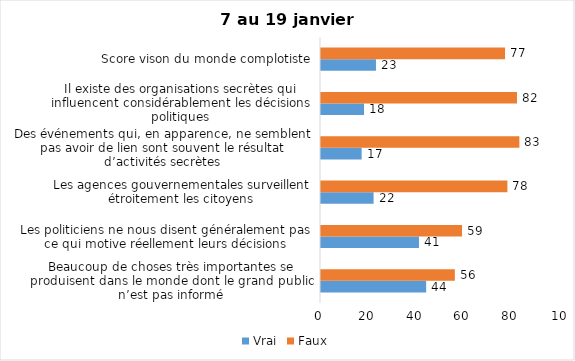
| Category | Vrai | Faux |
|---|---|---|
| Beaucoup de choses très importantes se produisent dans le monde dont le grand public n’est pas informé | 44 | 56 |
| Les politiciens ne nous disent généralement pas ce qui motive réellement leurs décisions | 41 | 59 |
| Les agences gouvernementales surveillent étroitement les citoyens | 22 | 78 |
| Des événements qui, en apparence, ne semblent pas avoir de lien sont souvent le résultat d’activités secrètes | 17 | 83 |
| Il existe des organisations secrètes qui influencent considérablement les décisions politiques | 18 | 82 |
| Score vison du monde complotiste | 23 | 77 |